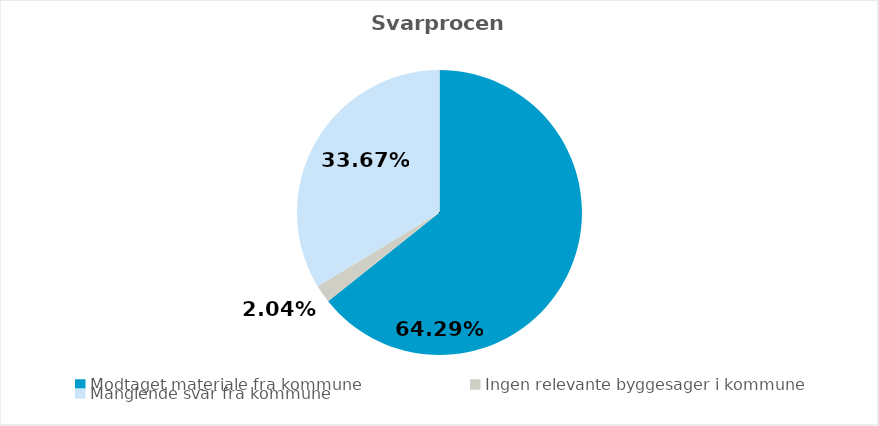
| Category | Series 0 |
|---|---|
| Modtaget materiale fra kommune | 0.643 |
| Ingen relevante byggesager i kommune | 0.02 |
| Manglende svar fra kommune | 0.337 |